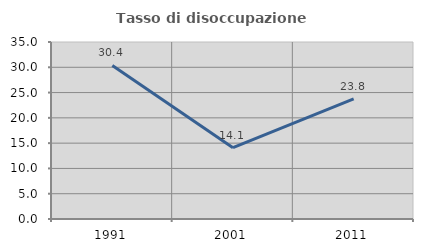
| Category | Tasso di disoccupazione giovanile  |
|---|---|
| 1991.0 | 30.363 |
| 2001.0 | 14.093 |
| 2011.0 | 23.765 |